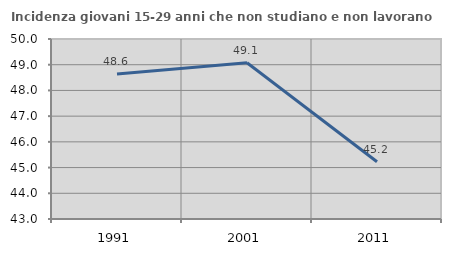
| Category | Incidenza giovani 15-29 anni che non studiano e non lavorano  |
|---|---|
| 1991.0 | 48.639 |
| 2001.0 | 49.074 |
| 2011.0 | 45.225 |